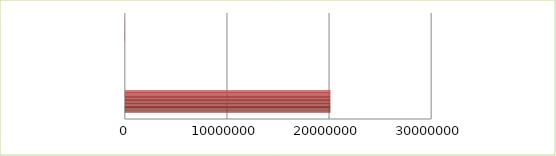
| Category | Series 0 | Series 1 |
|---|---|---|
| 0 | 2.5 | 20133528.5 |
| 1 | 2.6 | 0 |
| 2 | 2.7 | 21318 |